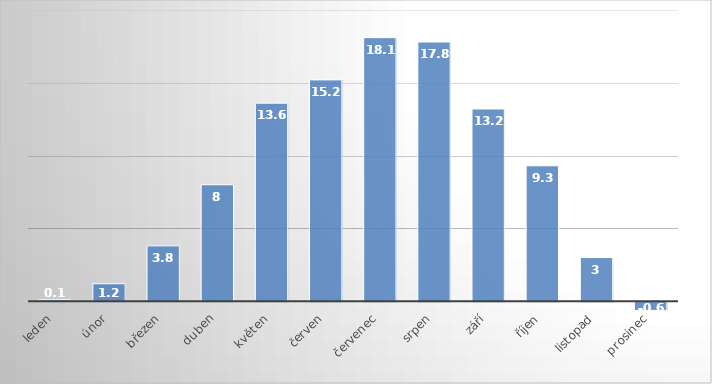
| Category | Series 0 |
|---|---|
| leden | 0.1 |
| únor | 1.2 |
| březen | 3.8 |
| duben | 8 |
| květen | 13.6 |
| červen | 15.2 |
| červenec | 18.1 |
| srpen | 17.8 |
| září | 13.2 |
| říjen | 9.3 |
| listopad | 3 |
| prosinec | -0.6 |